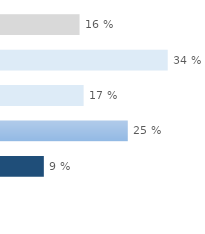
| Category | Series 0 |
|---|---|
| Non renseigné | 0.158 |
| < 50 € | 0.335 |
| 50 ≤ € < 100 | 0.166 |
| 100 ≤ € < 500 | 0.255 |
| ≥ 500 € | 0.086 |